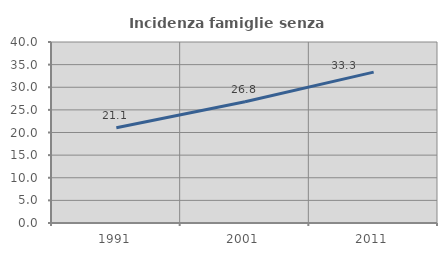
| Category | Incidenza famiglie senza nuclei |
|---|---|
| 1991.0 | 21.055 |
| 2001.0 | 26.783 |
| 2011.0 | 33.34 |